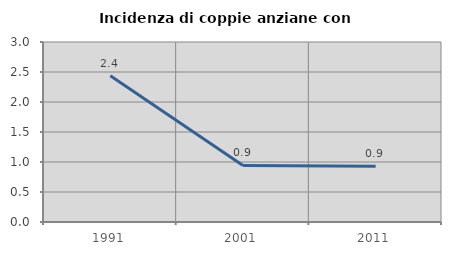
| Category | Incidenza di coppie anziane con figli |
|---|---|
| 1991.0 | 2.439 |
| 2001.0 | 0.943 |
| 2011.0 | 0.928 |